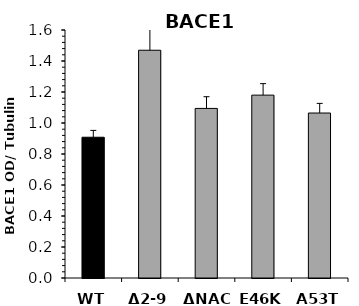
| Category | Series 0 |
|---|---|
| WT | 0.908 |
| Δ2-9 | 1.469 |
| ΔNAC | 1.094 |
| E46K | 1.18 |
| A53T | 1.064 |